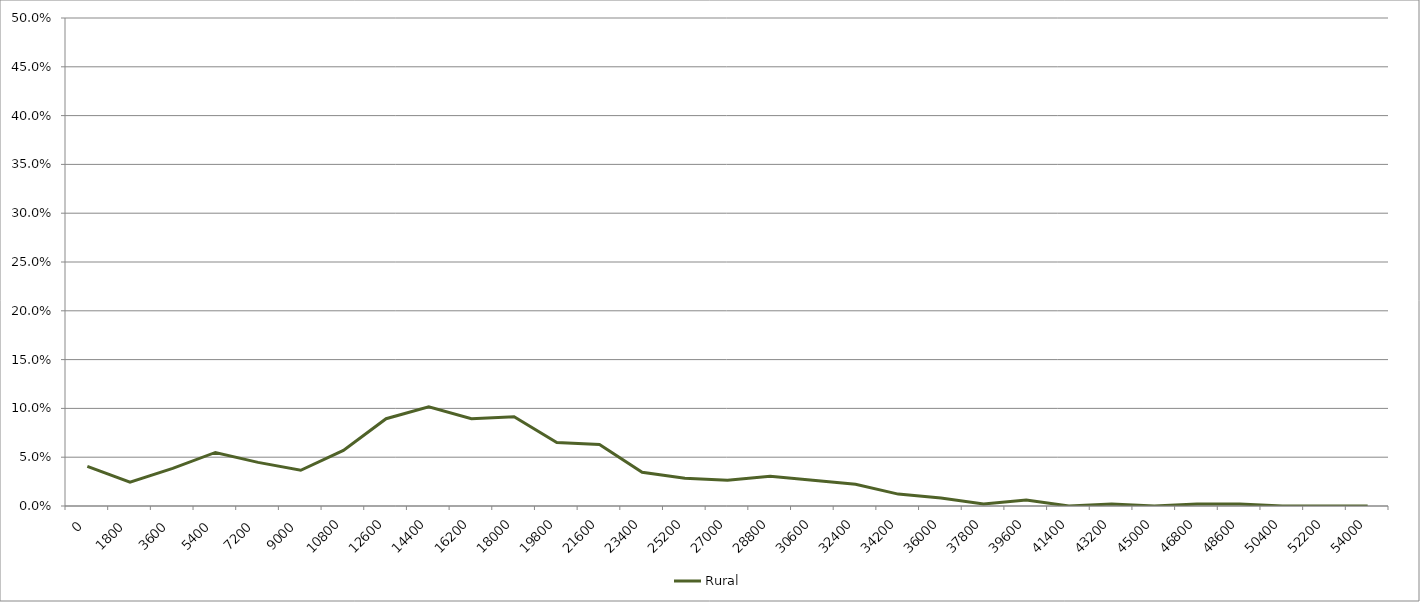
| Category | Rural |
|---|---|
| 0.0 | 0.041 |
| 1800.0 | 0.024 |
| 3600.0 | 0.039 |
| 5400.0 | 0.055 |
| 7200.0 | 0.045 |
| 9000.0 | 0.037 |
| 10800.0 | 0.057 |
| 12600.0 | 0.089 |
| 14400.0 | 0.102 |
| 16200.0 | 0.089 |
| 18000.0 | 0.091 |
| 19800.0 | 0.065 |
| 21600.0 | 0.063 |
| 23400.0 | 0.035 |
| 25200.0 | 0.028 |
| 27000.0 | 0.026 |
| 28800.0 | 0.03 |
| 30600.0 | 0.026 |
| 32400.0 | 0.022 |
| 34200.0 | 0.012 |
| 36000.0 | 0.008 |
| 37800.0 | 0.002 |
| 39600.0 | 0.006 |
| 41400.0 | 0 |
| 43200.0 | 0.002 |
| 45000.0 | 0 |
| 46800.0 | 0.002 |
| 48600.0 | 0.002 |
| 50400.0 | 0 |
| 52200.0 | 0 |
| 54000.0 | 0 |